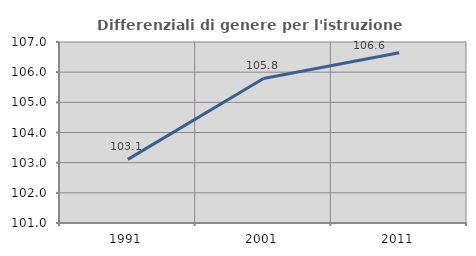
| Category | Differenziali di genere per l'istruzione superiore |
|---|---|
| 1991.0 | 103.108 |
| 2001.0 | 105.791 |
| 2011.0 | 106.645 |